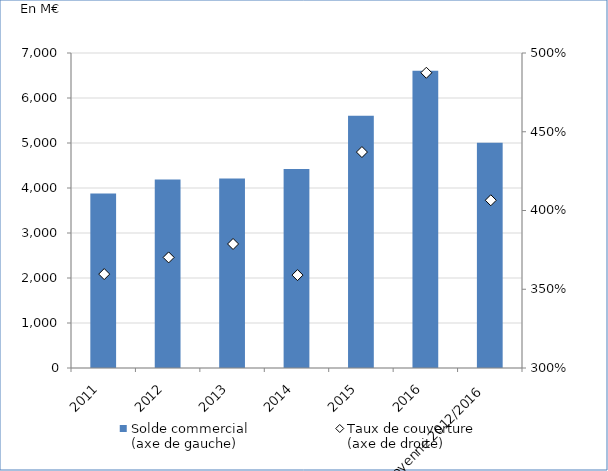
| Category | Solde commercial 
(axe de gauche) |
|---|---|
| 2011 | 3875.873 |
| 2012 | 4189.282 |
| 2013 | 4211.844 |
| 2014 | 4423.109 |
| 2015 | 5606.882 |
| 2016 | 6603.45 |
| Moyenne 2012/2016 | 5006.913 |